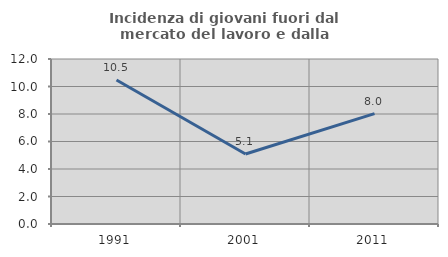
| Category | Incidenza di giovani fuori dal mercato del lavoro e dalla formazione  |
|---|---|
| 1991.0 | 10.472 |
| 2001.0 | 5.094 |
| 2011.0 | 8.023 |